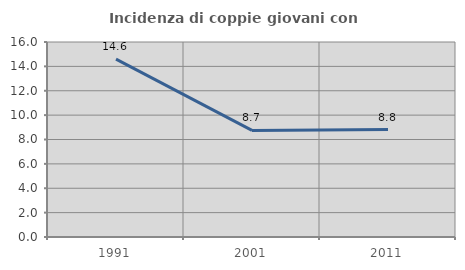
| Category | Incidenza di coppie giovani con figli |
|---|---|
| 1991.0 | 14.596 |
| 2001.0 | 8.746 |
| 2011.0 | 8.818 |